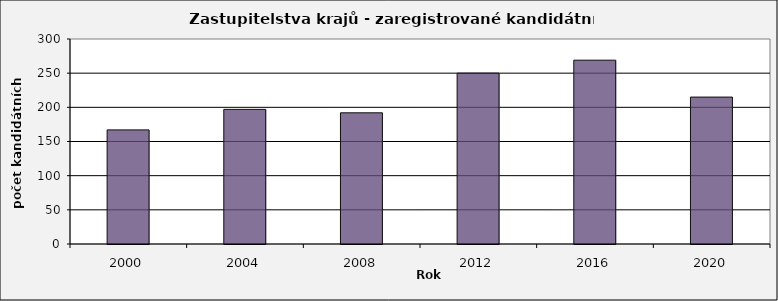
| Category | Počet zaregistrovaných kandidátních listin - celkem |
|---|---|
| 2000.0 | 167 |
| 2004.0 | 197 |
| 2008.0 | 192 |
| 2012.0 | 250 |
| 2016.0 | 269 |
| 2020.0 | 215 |